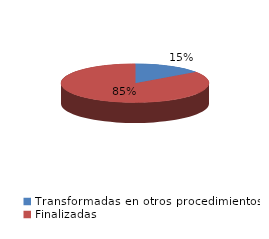
| Category | Series 0 |
|---|---|
| Transformadas en otros procedimientos | 3944 |
| Finalizadas | 21959 |